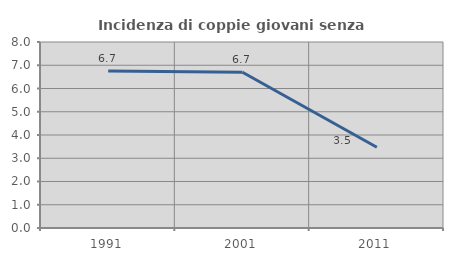
| Category | Incidenza di coppie giovani senza figli |
|---|---|
| 1991.0 | 6.75 |
| 2001.0 | 6.702 |
| 2011.0 | 3.474 |